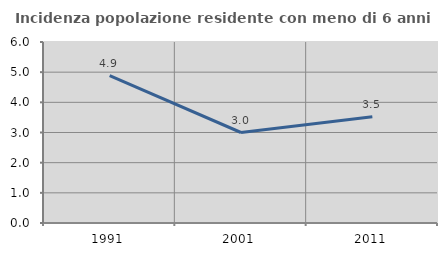
| Category | Incidenza popolazione residente con meno di 6 anni |
|---|---|
| 1991.0 | 4.888 |
| 2001.0 | 3 |
| 2011.0 | 3.519 |